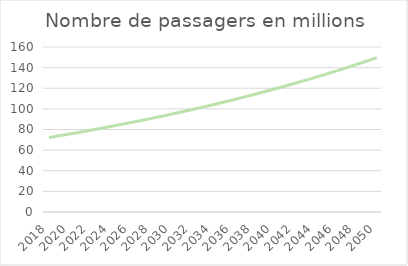
| Category | Nombre de passagers en millions |
|---|---|
| 2018.0 | 72.3 |
| 2019.0 | 73.963 |
| 2020.0 | 75.664 |
| 2021.0 | 77.404 |
| 2022.0 | 79.185 |
| 2023.0 | 81.006 |
| 2024.0 | 82.869 |
| 2025.0 | 84.775 |
| 2026.0 | 86.725 |
| 2027.0 | 88.719 |
| 2028.0 | 90.76 |
| 2029.0 | 92.848 |
| 2030.0 | 94.983 |
| 2031.0 | 97.168 |
| 2032.0 | 99.402 |
| 2033.0 | 101.689 |
| 2034.0 | 104.028 |
| 2035.0 | 106.42 |
| 2036.0 | 108.868 |
| 2037.0 | 111.372 |
| 2038.0 | 113.933 |
| 2039.0 | 116.554 |
| 2040.0 | 119.235 |
| 2041.0 | 121.977 |
| 2042.0 | 124.782 |
| 2043.0 | 127.652 |
| 2044.0 | 130.588 |
| 2045.0 | 133.592 |
| 2046.0 | 136.665 |
| 2047.0 | 139.808 |
| 2048.0 | 143.023 |
| 2049.0 | 146.313 |
| 2050.0 | 149.678 |